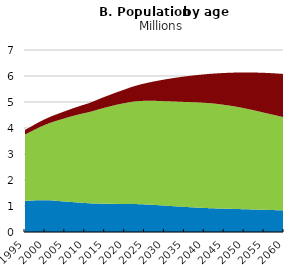
| Category | 0-14 | 15-64 | 65+ |
|---|---|---|---|
| 1995.0 | 1.199 | 2.55 | 0.177 |
| 1996.0 | 1.204 | 2.621 | 0.185 |
| 1997.0 | 1.212 | 2.692 | 0.193 |
| 1998.0 | 1.222 | 2.761 | 0.201 |
| 1999.0 | 1.226 | 2.828 | 0.21 |
| 2000.0 | 1.223 | 2.896 | 0.219 |
| 2001.0 | 1.221 | 2.959 | 0.228 |
| 2002.0 | 1.213 | 3.022 | 0.238 |
| 2003.0 | 1.199 | 3.084 | 0.248 |
| 2004.0 | 1.183 | 3.145 | 0.259 |
| 2005.0 | 1.172 | 3.203 | 0.27 |
| 2006.0 | 1.16 | 3.26 | 0.281 |
| 2007.0 | 1.15 | 3.313 | 0.292 |
| 2008.0 | 1.138 | 3.363 | 0.304 |
| 2009.0 | 1.13 | 3.411 | 0.317 |
| 2010.0 | 1.116 | 3.459 | 0.331 |
| 2011.0 | 1.106 | 3.502 | 0.346 |
| 2012.0 | 1.098 | 3.551 | 0.363 |
| 2013.0 | 1.095 | 3.6 | 0.381 |
| 2014.0 | 1.09 | 3.649 | 0.4 |
| 2015.0 | 1.087 | 3.694 | 0.419 |
| 2016.0 | 1.083 | 3.736 | 0.438 |
| 2017.0 | 1.083 | 3.776 | 0.457 |
| 2018.0 | 1.081 | 3.814 | 0.478 |
| 2019.0 | 1.079 | 3.848 | 0.499 |
| 2020.0 | 1.077 | 3.879 | 0.524 |
| 2021.0 | 1.078 | 3.909 | 0.549 |
| 2022.0 | 1.077 | 3.935 | 0.577 |
| 2023.0 | 1.073 | 3.956 | 0.605 |
| 2024.0 | 1.068 | 3.972 | 0.636 |
| 2025.0 | 1.062 | 3.984 | 0.668 |
| 2026.0 | 1.054 | 3.994 | 0.699 |
| 2027.0 | 1.045 | 4.002 | 0.732 |
| 2028.0 | 1.035 | 4.008 | 0.766 |
| 2029.0 | 1.025 | 4.013 | 0.799 |
| 2030.0 | 1.015 | 4.017 | 0.833 |
| 2031.0 | 1.005 | 4.022 | 0.863 |
| 2032.0 | 0.995 | 4.026 | 0.893 |
| 2033.0 | 0.985 | 4.03 | 0.922 |
| 2034.0 | 0.976 | 4.033 | 0.95 |
| 2035.0 | 0.966 | 4.036 | 0.978 |
| 2036.0 | 0.958 | 4.04 | 1.001 |
| 2037.0 | 0.949 | 4.044 | 1.024 |
| 2038.0 | 0.94 | 4.048 | 1.046 |
| 2039.0 | 0.932 | 4.049 | 1.069 |
| 2040.0 | 0.924 | 4.045 | 1.095 |
| 2041.0 | 0.918 | 4.041 | 1.118 |
| 2042.0 | 0.912 | 4.034 | 1.143 |
| 2043.0 | 0.907 | 4.023 | 1.169 |
| 2044.0 | 0.902 | 4.009 | 1.197 |
| 2045.0 | 0.897 | 3.992 | 1.227 |
| 2046.0 | 0.893 | 3.976 | 1.254 |
| 2047.0 | 0.889 | 3.957 | 1.282 |
| 2048.0 | 0.885 | 3.936 | 1.312 |
| 2049.0 | 0.88 | 3.911 | 1.343 |
| 2050.0 | 0.876 | 3.884 | 1.376 |
| 2051.0 | 0.872 | 3.857 | 1.407 |
| 2052.0 | 0.868 | 3.829 | 1.438 |
| 2053.0 | 0.863 | 3.798 | 1.47 |
| 2054.0 | 0.859 | 3.767 | 1.502 |
| 2055.0 | 0.854 | 3.734 | 1.534 |
| 2056.0 | 0.849 | 3.704 | 1.562 |
| 2057.0 | 0.845 | 3.674 | 1.588 |
| 2058.0 | 0.84 | 3.644 | 1.614 |
| 2059.0 | 0.835 | 3.613 | 1.639 |
| 2060.0 | 0.83 | 3.581 | 1.665 |